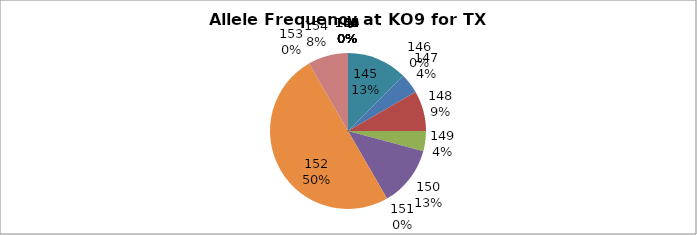
| Category | Series 0 |
|---|---|
| 140.0 | 0 |
| 141.0 | 0 |
| 142.0 | 0 |
| 143.0 | 0 |
| 145.0 | 0.125 |
| 146.0 | 0 |
| 147.0 | 0.042 |
| 148.0 | 0.083 |
| 149.0 | 0.042 |
| 150.0 | 0.125 |
| 151.0 | 0 |
| 152.0 | 0.5 |
| 153.0 | 0 |
| 154.0 | 0.083 |
| 155.0 | 0 |
| 156.0 | 0 |
| 158.0 | 0 |
| 160.0 | 0 |
| 161.0 | 0 |
| 162.0 | 0 |
| 164.0 | 0 |
| 166.0 | 0 |